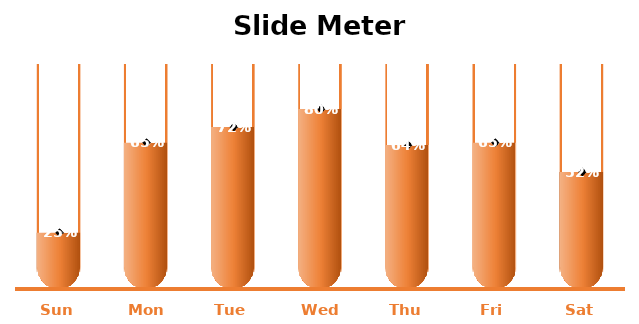
| Category | Max | SL% |
|---|---|---|
| Sun | 1 | 0.25 |
| Mon | 1 | 0.65 |
| Tue | 1 | 0.72 |
| Wed | 1 | 0.8 |
| Thu | 1 | 0.64 |
| Fri | 1 | 0.65 |
| Sat | 1 | 0.52 |